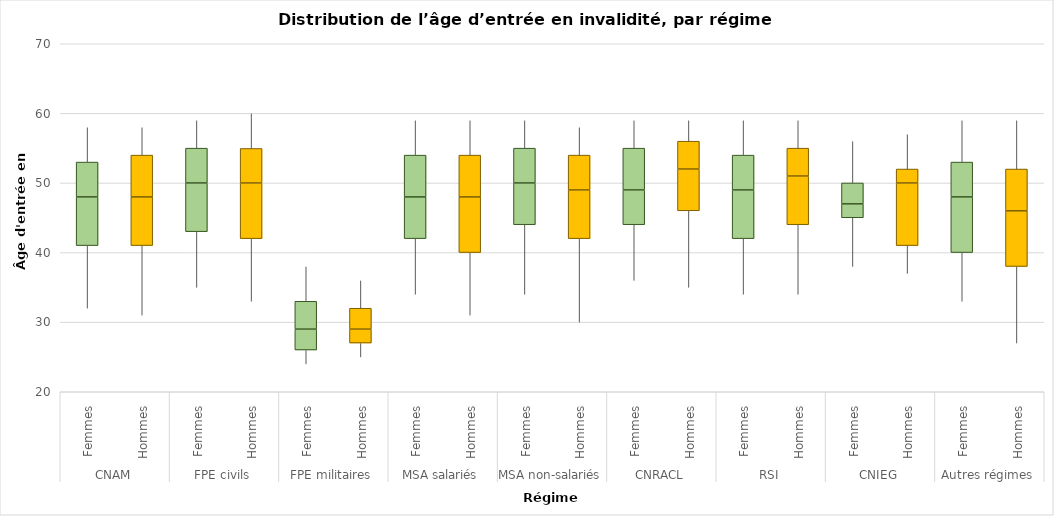
| Category | Series 0 | Series 1 | Series 2 | Series 3 | Series 4 |
|---|---|---|---|---|---|
| 0 | 32 | 9 | 7 | 5 | 5 |
| 1 | 31 | 10 | 7 | 6 | 4 |
| 2 | 35 | 8 | 7 | 5 | 4 |
| 3 | 33 | 9 | 8 | 4.954 | 5.046 |
| 4 | 24 | 2 | 3 | 4 | 5 |
| 5 | 25 | 2 | 2 | 3 | 4 |
| 6 | 34 | 8 | 6 | 6 | 5 |
| 7 | 31 | 9 | 8 | 6 | 5 |
| 8 | 34 | 10 | 6 | 5 | 4 |
| 9 | 30 | 12 | 7 | 5 | 4 |
| 10 | 36 | 8 | 5 | 6 | 4 |
| 11 | 35 | 11 | 6 | 4 | 3 |
| 12 | 34 | 8 | 7 | 5 | 5 |
| 13 | 34 | 10 | 7 | 4 | 4 |
| 14 | 38 | 7 | 2 | 3 | 6 |
| 15 | 37 | 4 | 9 | 2 | 5 |
| 16 | 33 | 7 | 8 | 5 | 6 |
| 17 | 27 | 11 | 8 | 6 | 7 |